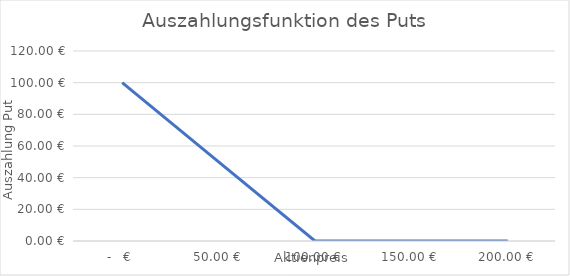
| Category | P(1) |
|---|---|
| 0.0 | 100 |
| 50.0 | 50 |
| 100.0 | 0 |
| 150.0 | 0 |
| 200.0 | 0 |